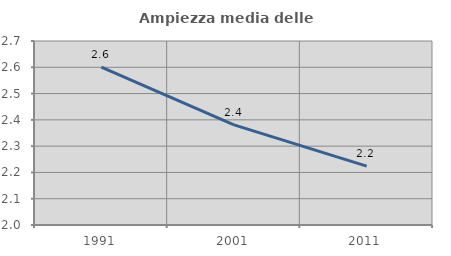
| Category | Ampiezza media delle famiglie |
|---|---|
| 1991.0 | 2.6 |
| 2001.0 | 2.381 |
| 2011.0 | 2.224 |